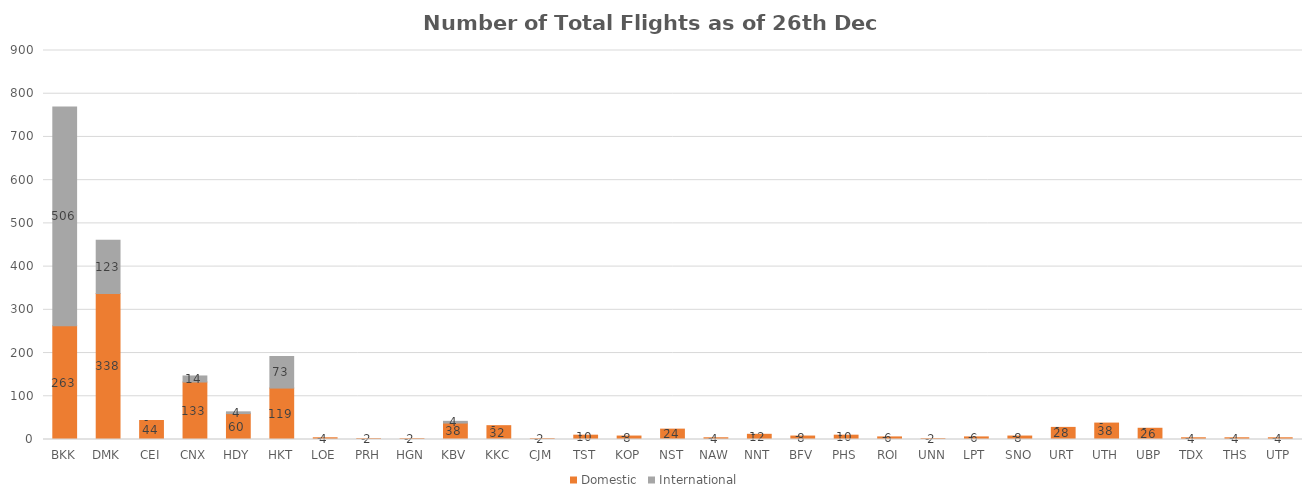
| Category | Domestic | International |
|---|---|---|
| BKK | 263 | 506 |
| DMK | 338 | 123 |
| CEI | 44 | 0 |
| CNX | 133 | 14 |
| HDY | 60 | 4 |
| HKT | 119 | 73 |
| LOE | 4 | 0 |
| PRH | 2 | 0 |
| HGN | 2 | 0 |
| KBV | 38 | 4 |
| KKC | 32 | 0 |
| CJM | 2 | 0 |
| TST | 10 | 0 |
| KOP | 8 | 0 |
| NST | 24 | 0 |
| NAW | 4 | 0 |
| NNT | 12 | 0 |
| BFV | 8 | 0 |
| PHS | 10 | 0 |
| ROI | 6 | 0 |
| UNN | 2 | 0 |
| LPT | 6 | 0 |
| SNO | 8 | 0 |
| URT | 28 | 0 |
| UTH | 38 | 0 |
| UBP | 26 | 0 |
| TDX | 4 | 0 |
| THS | 4 | 0 |
| UTP | 4 | 0 |